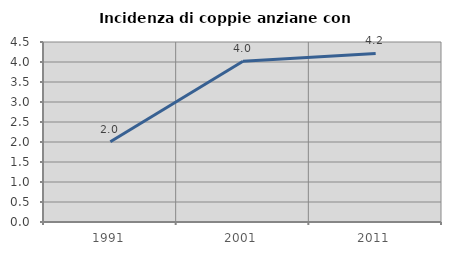
| Category | Incidenza di coppie anziane con figli |
|---|---|
| 1991.0 | 2.004 |
| 2001.0 | 4.018 |
| 2011.0 | 4.213 |